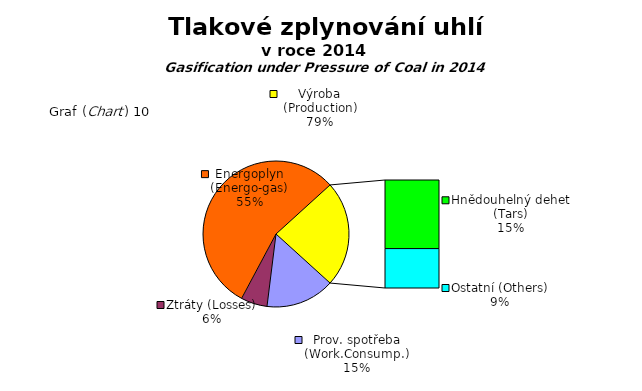
| Category | Series 0 |
|---|---|
| Prov. spotřeba (Work.Consump.) | 3634933 |
| Ztráty (Losses) | 1391875 |
| Energoplyn (Energo-gas) | 13225784 |
| Hnědouhelný dehet (Tars) | 3551819 |
| Ostatní (Others) | 2040563 |